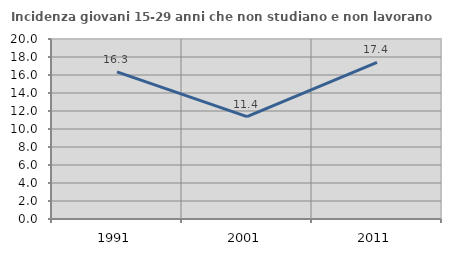
| Category | Incidenza giovani 15-29 anni che non studiano e non lavorano  |
|---|---|
| 1991.0 | 16.34 |
| 2001.0 | 11.368 |
| 2011.0 | 17.391 |